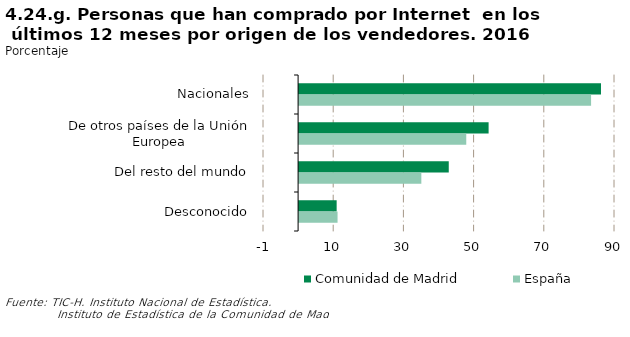
| Category | Comunidad de Madrid | España |
|---|---|---|
| Nacionales | 86.009 | 83.188 |
| De otros países de la Unión Europea | 53.989 | 47.625 |
| Del resto del mundo | 42.636 | 34.825 |
| Desconocido | 10.698 | 10.958 |